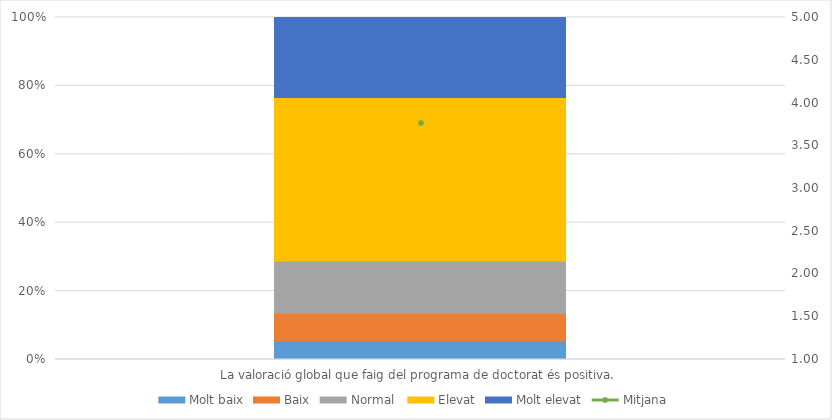
| Category | Molt baix | Baix | Normal  | Elevat | Molt elevat |
|---|---|---|---|---|---|
| La valoració global que faig del programa de doctorat és positiva. | 6 | 9 | 17 | 53 | 26 |